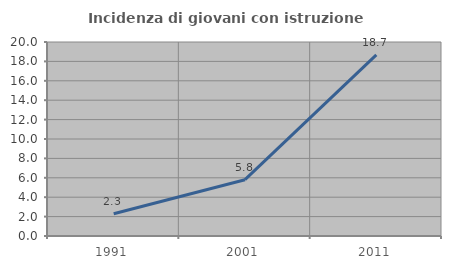
| Category | Incidenza di giovani con istruzione universitaria |
|---|---|
| 1991.0 | 2.29 |
| 2001.0 | 5.806 |
| 2011.0 | 18.671 |